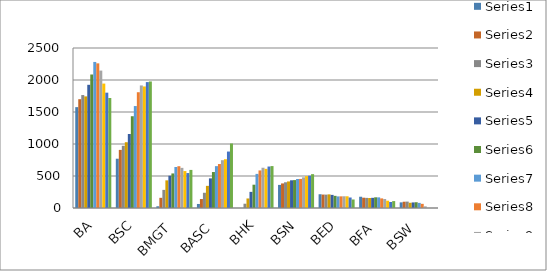
| Category | Series 0 | Series 1 | Series 2 | Series 3 | Series 4 | Series 5 | Series 6 | Series 7 | Series 8 | Series 9 | Series 10 | Series 11 |
|---|---|---|---|---|---|---|---|---|---|---|---|---|
| BA | 1576 | 1700 | 1765 | 1744 | 1925 | 2086 | 2282 | 2260 | 2147 | 1944 | 1802 | 1719 |
| BSC | 770 | 908 | 972 | 1028 | 1156 | 1434 | 1593 | 1809 | 1915 | 1899 | 1967 | 1977 |
| BMGT | 27 | 159 | 283 | 432 | 504 | 540 | 641 | 653 | 627 | 577 | 546 | 595 |
| BASC | 63 | 140 | 238 | 346 | 463 | 562 | 654 | 687 | 747 | 762 | 882 | 1008 |
| BHK | 0 | 0 | 67 | 149 | 252 | 364 | 533 | 587 | 629 | 612 | 648 | 655 |
| BSN | 361 | 384 | 402 | 415 | 433 | 436 | 453 | 454 | 479 | 498 | 504 | 529 |
| BED | 215 | 210 | 209 | 213 | 205 | 190 | 181 | 182 | 183 | 183 | 164 | 133 |
| BFA | 176 | 161 | 158 | 156 | 159 | 167 | 166 | 150 | 141 | 114 | 94 | 108 |
| BSW | 88 | 98 | 100 | 82 | 87 | 90 | 80 | 65 | 26 | 0 | 0 | 0 |